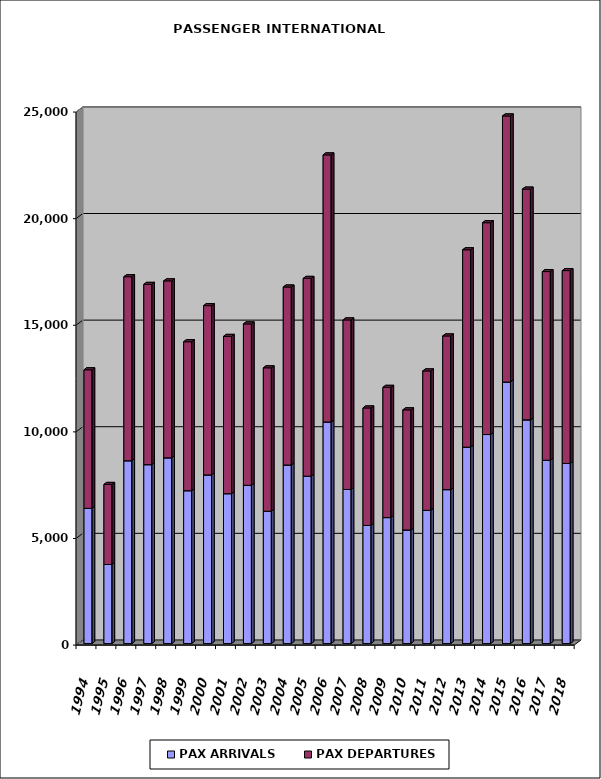
| Category | PAX ARRIVALS | PAX DEPARTURES |
|---|---|---|
| 1994.0 | 6343 | 6497 |
| 1995.0 | 3708 | 3755 |
| 1996.0 | 8574 | 8631 |
| 1997.0 | 8391 | 8454 |
| 1998.0 | 8711 | 8299 |
| 1999.0 | 7169 | 6987 |
| 2000.0 | 7908 | 7940 |
| 2001.0 | 7029 | 7377 |
| 2002.0 | 7421 | 7572 |
| 2003.0 | 6206 | 6727 |
| 2004.0 | 8374 | 8348 |
| 2005.0 | 7850 | 9276 |
| 2006.0 | 10392 | 12526 |
| 2007.0 | 7227 | 7952 |
| 2008.0 | 5539 | 5511 |
| 2009.0 | 5908 | 6108 |
| 2010.0 | 5328 | 5633 |
| 2011.0 | 6248 | 6538 |
| 2012.0 | 7220 | 7207 |
| 2013.0 | 9213 | 9255 |
| 2014.0 | 9804 | 9934 |
| 2015.0 | 12266 | 12479 |
| 2016.0 | 10492 | 10822 |
| 2017.0 | 8596 | 8850 |
| 2018.0 | 8448 | 9044 |